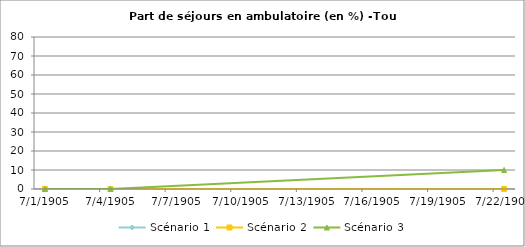
| Category | Scénario 1 | Scénario 2 | Scénario 3 |
|---|---|---|---|
| 2009.0 | 0.003 | 0.003 | 0.003 |
| 2012.0 | 0.003 | 0.003 | 0.003 |
| 2030.0 | 0.008 | 0.055 | 10 |